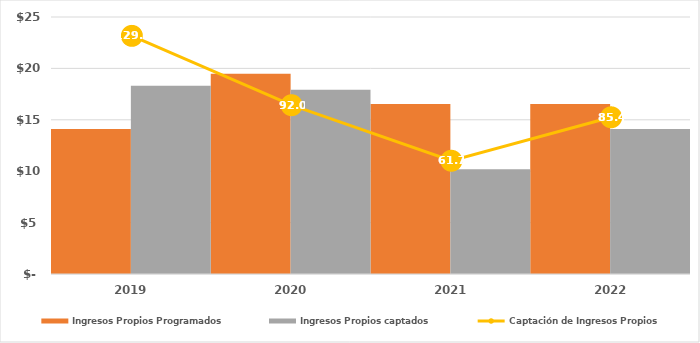
| Category | Ingresos Propios Programados | Ingresos Propios captados |
|---|---|---|
| 2019.0 | 14115.571 | 18310.548 |
| 2020.0 | 19486.078 | 17917.975 |
| 2021.0 | 16529.292 | 10196.453 |
| 2022.0 | 16529.292 | 14110.939 |